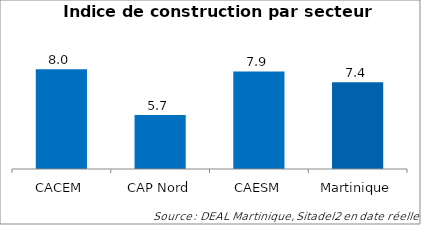
| Category | Series 0 |
|---|---|
| CACEM | 8.029 |
| CAP Nord | 5.729 |
| CAESM | 7.917 |
| Martinique | 7.373 |